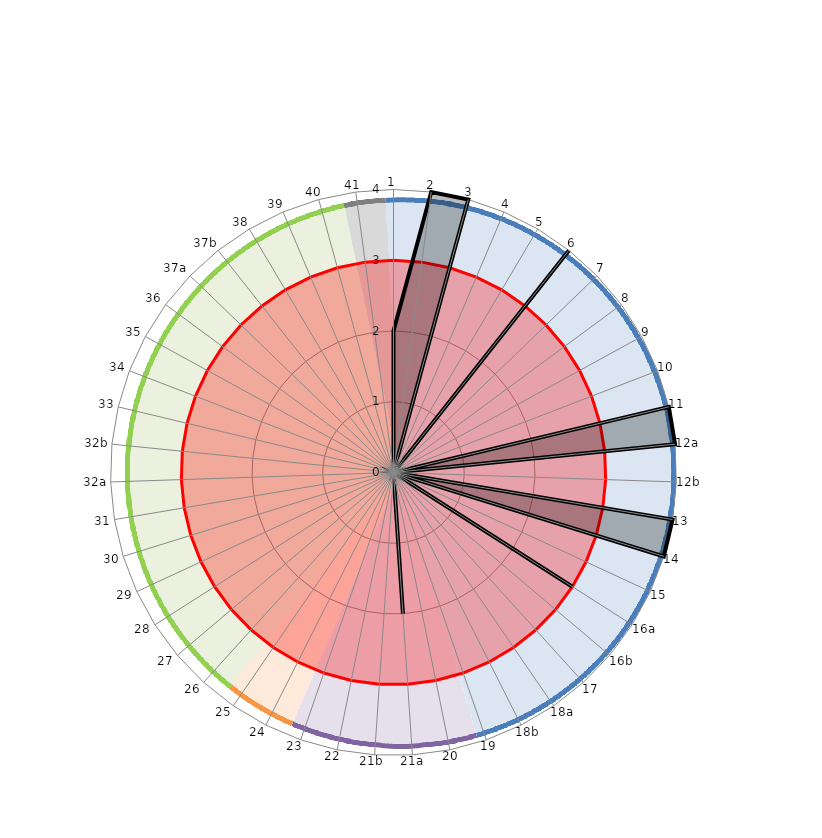
| Category | Series 2 | Series 3 | Series 4 | Series 5 | Target maturity | Overall Assessment |
|---|---|---|---|---|---|---|
| 1 |  |  |  |  | 3 | 2 |
| 2 |  |  |  |  | 3 | 4 |
| 3 |  |  |  |  | 3 | 4 |
| 4 |  |  |  |  | 3 | 0 |
| 5 |  |  |  |  | 3 | 0 |
| 6 |  |  |  |  | 3 | 4 |
| 7 |  |  |  |  | 3 | 0 |
| 8 |  |  |  |  | 3 | 0 |
| 9 |  |  |  |  | 3 | 0 |
| 10 |  |  |  |  | 3 | 0 |
| 11 |  |  |  |  | 3 | 4 |
| 12a |  |  |  |  | 3 | 4 |
| 12b |  |  |  |  | 3 | 0 |
| 13 |  |  |  |  | 3 | 4 |
| 14 |  |  |  |  | 3 | 4 |
| 15 |  |  |  |  | 3 | 0 |
| 16a |  |  |  |  | 3 | 3 |
| 16b |  |  |  |  | 3 | 0 |
| 17 |  |  |  |  | 3 | 0 |
| 18a |  |  |  |  | 3 | 0 |
| 18b |  |  |  |  | 3 | 0 |
| 19 |  |  |  |  | 3 | 0 |
| 20 |  |  |  |  | 3 | 0 |
| 21a |  |  |  |  | 3 | 2 |
| 21b |  |  |  |  | 3 | 0 |
| 22 |  |  |  |  | 3 | 0 |
| 23 |  |  |  |  | 3 | 0 |
| 24 |  |  |  |  | 3 | 0 |
| 25 |  |  |  |  | 3 | 0 |
| 26 |  |  |  |  | 3 | 0 |
| 27 |  |  |  |  | 3 | 0 |
| 28 |  |  |  |  | 3 | 0 |
| 29 |  |  |  |  | 3 | 0 |
| 30 |  |  |  |  | 3 | 0 |
| 31 |  |  |  |  | 3 | 0 |
| 32a |  |  |  |  | 3 | 0 |
| 32b |  |  |  |  | 3 | 0 |
| 33 |  |  |  |  | 3 | 0 |
| 34 |  |  |  |  | 3 | 0 |
| 35 |  |  |  |  | 3 | 0 |
| 36 |  |  |  |  | 3 | 0 |
| 37a |  |  |  |  | 3 | 0 |
| 37b |  |  |  |  | 3 | 0 |
| 38 |  |  |  |  | 3 | 0 |
| 39 |  |  |  |  | 3 | 0 |
| 40 |  |  |  |  | 3 | 0 |
| 41 |  |  |  |  | 3 | 0 |